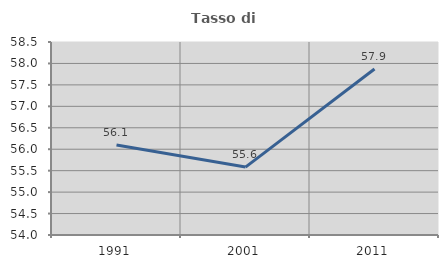
| Category | Tasso di occupazione   |
|---|---|
| 1991.0 | 56.098 |
| 2001.0 | 55.584 |
| 2011.0 | 57.871 |